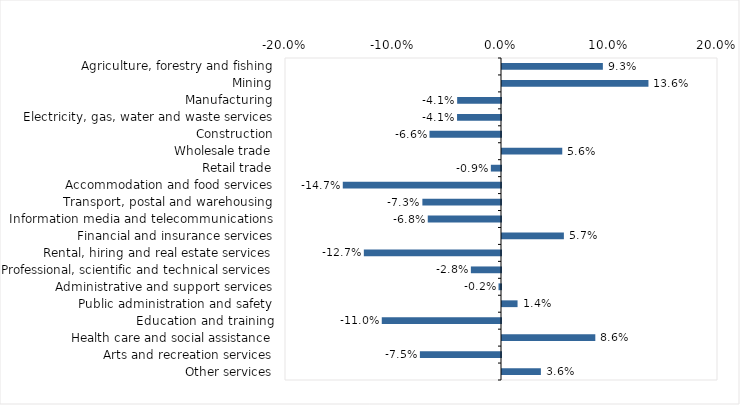
| Category | This week |
|---|---|
| Agriculture, forestry and fishing | 0.093 |
| Mining | 0.136 |
| Manufacturing | -0.041 |
| Electricity, gas, water and waste services | -0.041 |
| Construction | -0.066 |
| Wholesale trade | 0.056 |
| Retail trade | -0.009 |
| Accommodation and food services | -0.146 |
| Transport, postal and warehousing | -0.073 |
| Information media and telecommunications | -0.068 |
| Financial and insurance services | 0.057 |
| Rental, hiring and real estate services | -0.127 |
| Professional, scientific and technical services | -0.028 |
| Administrative and support services | -0.002 |
| Public administration and safety | 0.014 |
| Education and training | -0.11 |
| Health care and social assistance | 0.086 |
| Arts and recreation services | -0.075 |
| Other services | 0.036 |